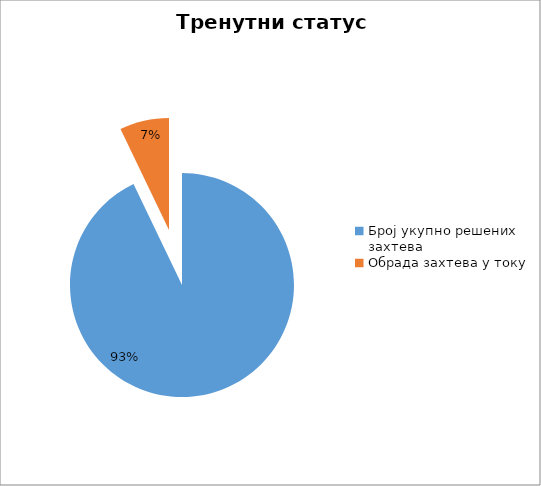
| Category | Series 0 |
|---|---|
| Број укупно решених захтева | 44230 |
| Обрада захтева у току | 3394 |